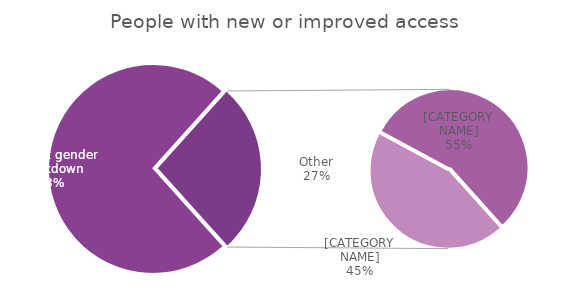
| Category | People with new or improved access |
|---|---|
| Without gender breakdown | 551879951.333 |
| Male | 89463067.333 |
| Female | 111433493 |